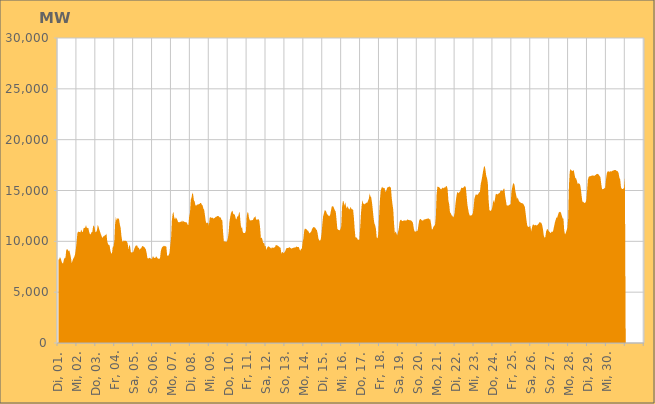
| Category | Series 0 |
|---|---|
|  Di, 01.  | 8195.748 |
|  Di, 01.  | 8238.849 |
|  Di, 01.  | 8448.213 |
|  Di, 01.  | 8317.278 |
|  Di, 01.  | 8026.775 |
|  Di, 01.  | 7834.665 |
|  Di, 01.  | 7841.233 |
|  Di, 01.  | 8211.818 |
|  Di, 01.  | 8380.311 |
|  Di, 01.  | 8387.251 |
|  Di, 01.  | 9177.025 |
|  Di, 01.  | 9213.49 |
|  Di, 01.  | 9177.197 |
|  Di, 01.  | 9025.483 |
|  Di, 01.  | 9093.851 |
|  Di, 01.  | 8730.426 |
|  Di, 01.  | 8338.928 |
|  Mi, 02.  | 7829.012 |
|  Mi, 02.  | 8128.96 |
|  Mi, 02.  | 8304.714 |
|  Mi, 02.  | 8447.873 |
|  Mi, 02.  | 8667.192 |
|  Mi, 02.  | 9152.786 |
|  Mi, 02.  | 9833.066 |
|  Mi, 02.  | 10735.695 |
|  Mi, 02.  | 10973.93 |
|  Mi, 02.  | 10916.105 |
|  Mi, 02.  | 10926.679 |
|  Mi, 02.  | 10882.582 |
|  Mi, 02.  | 11165.676 |
|  Mi, 02.  | 10942.484 |
|  Mi, 02.  | 10916.844 |
|  Mi, 02.  | 11291.559 |
|  Mi, 02.  | 11317.902 |
|  Mi, 02.  | 11347.952 |
|  Mi, 02.  | 11594.607 |
|  Mi, 02.  | 11353.739 |
|  Mi, 02.  | 11295.324 |
|  Mi, 02.  | 11309.941 |
|  Mi, 02.  | 10937.813 |
|  Mi, 02.  | 10712.686 |
|  Do, 03.  | 10686.607 |
|  Do, 03.  | 10903.154 |
|  Do, 03.  | 10908.265 |
|  Do, 03.  | 11449.21 |
|  Do, 03.  | 11578.012 |
|  Do, 03.  | 11331.532 |
|  Do, 03.  | 10887.95 |
|  Do, 03.  | 10930.703 |
|  Do, 03.  | 11110.092 |
|  Do, 03.  | 11633.787 |
|  Do, 03.  | 11418.343 |
|  Do, 03.  | 11127.158 |
|  Do, 03.  | 10905.367 |
|  Do, 03.  | 10682.636 |
|  Do, 03.  | 10485.257 |
|  Do, 03.  | 10315.151 |
|  Do, 03.  | 10492.304 |
|  Do, 03.  | 10504.689 |
|  Do, 03.  | 10591.212 |
|  Do, 03.  | 10631.174 |
|  Do, 03.  | 10757.819 |
|  Do, 03.  | 9997.156 |
|  Do, 03.  | 9725.87 |
|  Do, 03.  | 9635.19 |
|  Fr, 04.  | 9598.394 |
|  Fr, 04.  | 9080.654 |
|  Fr, 04.  | 8808.541 |
|  Fr, 04.  | 8827.586 |
|  Fr, 04.  | 9450.754 |
|  Fr, 04.  | 9495.729 |
|  Fr, 04.  | 10032.6 |
|  Fr, 04.  | 11703.268 |
|  Fr, 04.  | 12401.475 |
|  Fr, 04.  | 12034.678 |
|  Fr, 04.  | 12263.784 |
|  Fr, 04.  | 12267.227 |
|  Fr, 04.  | 12158.76 |
|  Fr, 04.  | 11661.449 |
|  Fr, 04.  | 11325.073 |
|  Fr, 04.  | 10535.536 |
|  Fr, 04.  | 10026.175 |
|  Fr, 04.  | 9957.082 |
|  Fr, 04.  | 10100.934 |
|  Fr, 04.  | 10036.933 |
|  Fr, 04.  | 10050.077 |
|  Fr, 04.  | 10037.434 |
|  Fr, 04.  | 9974.075 |
|  Fr, 04.  | 9746.908 |
|  Sa, 05.  | 9178.41 |
|  Sa, 05.  | 9691.841 |
|  Sa, 05.  | 9490.762 |
|  Sa, 05.  | 8945.014 |
|  Sa, 05.  | 8897.307 |
|  Sa, 05.  | 8922.861 |
|  Sa, 05.  | 8954.198 |
|  Sa, 05.  | 9203.137 |
|  Sa, 05.  | 9402.483 |
|  Sa, 05.  | 9558.636 |
|  Sa, 05.  | 9597.176 |
|  Sa, 05.  | 9587.965 |
|  Sa, 05.  | 9354.447 |
|  Sa, 05.  | 9389.859 |
|  Sa, 05.  | 9162.686 |
|  Sa, 05.  | 9291.054 |
|  Sa, 05.  | 9308.196 |
|  Sa, 05.  | 9484.902 |
|  Sa, 05.  | 9557.742 |
|  Sa, 05.  | 9482.572 |
|  Sa, 05.  | 9433.346 |
|  Sa, 05.  | 9336.187 |
|  Sa, 05.  | 9199.284 |
|  Sa, 05.  | 8848.052 |
|  So, 06.  | 8344.83 |
|  So, 06.  | 8314.266 |
|  So, 06.  | 8345.908 |
|  So, 06.  | 8396.474 |
|  So, 06.  | 8318.311 |
|  So, 06.  | 8248.532 |
|  So, 06.  | 8317.737 |
|  So, 06.  | 8555.444 |
|  So, 06.  | 8428.29 |
|  So, 06.  | 8365.316 |
|  So, 06.  | 8372.023 |
|  So, 06.  | 8532.385 |
|  So, 06.  | 8435.157 |
|  So, 06.  | 8331.923 |
|  So, 06.  | 8282.984 |
|  So, 06.  | 8276.148 |
|  So, 06.  | 8359.805 |
|  So, 06.  | 9040.527 |
|  So, 06.  | 9328.213 |
|  So, 06.  | 9456 |
|  So, 06.  | 9506.892 |
|  So, 06.  | 9581.173 |
|  So, 06.  | 9507.567 |
|  So, 06.  | 9530.964 |
|  Mo, 07.  | 9476.245 |
|  Mo, 07.  | 8650.818 |
|  Mo, 07.  | 8542.105 |
|  Mo, 07.  | 8649.919 |
|  Mo, 07.  | 8855.606 |
|  Mo, 07.  | 9636.52 |
|  Mo, 07.  | 10288.136 |
|  Mo, 07.  | 12020.957 |
|  Mo, 07.  | 12712.978 |
|  Mo, 07.  | 12901.594 |
|  Mo, 07.  | 12364.981 |
|  Mo, 07.  | 12151.775 |
|  Mo, 07.  | 12352.799 |
|  Mo, 07.  | 12254.523 |
|  Mo, 07.  | 12107.756 |
|  Mo, 07.  | 11871.108 |
|  Mo, 07.  | 11903.832 |
|  Mo, 07.  | 11871.006 |
|  Mo, 07.  | 11932.709 |
|  Mo, 07.  | 11910.709 |
|  Mo, 07.  | 12060.214 |
|  Mo, 07.  | 11881.257 |
|  Mo, 07.  | 12016.33 |
|  Mo, 07.  | 11898.64 |
|  Di, 08.  | 11883.132 |
|  Di, 08.  | 11891.17 |
|  Di, 08.  | 11851.836 |
|  Di, 08.  | 11636.756 |
|  Di, 08.  | 11610.184 |
|  Di, 08.  | 12455.817 |
|  Di, 08.  | 12805.531 |
|  Di, 08.  | 14065.491 |
|  Di, 08.  | 14323.256 |
|  Di, 08.  | 14791.72 |
|  Di, 08.  | 14610.173 |
|  Di, 08.  | 14030.744 |
|  Di, 08.  | 13913.304 |
|  Di, 08.  | 13527.604 |
|  Di, 08.  | 13522.695 |
|  Di, 08.  | 13608.676 |
|  Di, 08.  | 13617.428 |
|  Di, 08.  | 13650.402 |
|  Di, 08.  | 13669.478 |
|  Di, 08.  | 13770.425 |
|  Di, 08.  | 13771.482 |
|  Di, 08.  | 13608.11 |
|  Di, 08.  | 13541.896 |
|  Di, 08.  | 13222.64 |
|  Mi, 09.  | 13104.114 |
|  Mi, 09.  | 12565.42 |
|  Mi, 09.  | 11981.096 |
|  Mi, 09.  | 11765.054 |
|  Mi, 09.  | 11837.351 |
|  Mi, 09.  | 11810.66 |
|  Mi, 09.  | 11563.377 |
|  Mi, 09.  | 12322.461 |
|  Mi, 09.  | 12384.471 |
|  Mi, 09.  | 12313.741 |
|  Mi, 09.  | 12311.941 |
|  Mi, 09.  | 12323.85 |
|  Mi, 09.  | 12226.455 |
|  Mi, 09.  | 12291.333 |
|  Mi, 09.  | 12339.328 |
|  Mi, 09.  | 12420.534 |
|  Mi, 09.  | 12438.141 |
|  Mi, 09.  | 12504.573 |
|  Mi, 09.  | 12492.546 |
|  Mi, 09.  | 12412.849 |
|  Mi, 09.  | 12338.849 |
|  Mi, 09.  | 12359.02 |
|  Mi, 09.  | 12113.066 |
|  Mi, 09.  | 12091.532 |
|  Do, 10.  | 10925.678 |
|  Do, 10.  | 10020.023 |
|  Do, 10.  | 9986.644 |
|  Do, 10.  | 9976.224 |
|  Do, 10.  | 9940.36 |
|  Do, 10.  | 10017.58 |
|  Do, 10.  | 10280.962 |
|  Do, 10.  | 10827.935 |
|  Do, 10.  | 11855.459 |
|  Do, 10.  | 12372.422 |
|  Do, 10.  | 12772.304 |
|  Do, 10.  | 12936.441 |
|  Do, 10.  | 13012.453 |
|  Do, 10.  | 12702.477 |
|  Do, 10.  | 12659.864 |
|  Do, 10.  | 12607.085 |
|  Do, 10.  | 12252.856 |
|  Do, 10.  | 12141.641 |
|  Do, 10.  | 12461.787 |
|  Do, 10.  | 12429.468 |
|  Do, 10.  | 12713.405 |
|  Do, 10.  | 12908.483 |
|  Do, 10.  | 11999.901 |
|  Do, 10.  | 11261.483 |
|  Fr, 11.  | 11475.599 |
|  Fr, 11.  | 10923.63 |
|  Fr, 11.  | 10827.726 |
|  Fr, 11.  | 10810.376 |
|  Fr, 11.  | 10832.162 |
|  Fr, 11.  | 11015.182 |
|  Fr, 11.  | 12455.202 |
|  Fr, 11.  | 12860.272 |
|  Fr, 11.  | 12793.256 |
|  Fr, 11.  | 12273.488 |
|  Fr, 11.  | 12073.613 |
|  Fr, 11.  | 12056.748 |
|  Fr, 11.  | 12067.402 |
|  Fr, 11.  | 12081.542 |
|  Fr, 11.  | 12110.027 |
|  Fr, 11.  | 12319.636 |
|  Fr, 11.  | 12353.928 |
|  Fr, 11.  | 12471.629 |
|  Fr, 11.  | 12120.726 |
|  Fr, 11.  | 12150.662 |
|  Fr, 11.  | 12142.492 |
|  Fr, 11.  | 12181.85 |
|  Fr, 11.  | 12042.792 |
|  Fr, 11.  | 11352.511 |
|  Sa, 12.  | 10322.609 |
|  Sa, 12.  | 10375.244 |
|  Sa, 12.  | 10155.103 |
|  Sa, 12.  | 9783.303 |
|  Sa, 12.  | 9906.55 |
|  Sa, 12.  | 9518.944 |
|  Sa, 12.  | 9556.322 |
|  Sa, 12.  | 9163.012 |
|  Sa, 12.  | 9375.98 |
|  Sa, 12.  | 9474.36 |
|  Sa, 12.  | 9514.349 |
|  Sa, 12.  | 9435.292 |
|  Sa, 12.  | 9368.071 |
|  Sa, 12.  | 9288.444 |
|  Sa, 12.  | 9407.215 |
|  Sa, 12.  | 9367.282 |
|  Sa, 12.  | 9364.493 |
|  Sa, 12.  | 9391.802 |
|  Sa, 12.  | 9447.633 |
|  Sa, 12.  | 9641.122 |
|  Sa, 12.  | 9605.457 |
|  Sa, 12.  | 9595.95 |
|  Sa, 12.  | 9530.542 |
|  Sa, 12.  | 9479.684 |
|  So, 13.  | 9402.282 |
|  So, 13.  | 9353.528 |
|  So, 13.  | 8787.718 |
|  So, 13.  | 8959.875 |
|  So, 13.  | 8888.206 |
|  So, 13.  | 8819.799 |
|  So, 13.  | 8940.93 |
|  So, 13.  | 9061.199 |
|  So, 13.  | 9282.269 |
|  So, 13.  | 9343.571 |
|  So, 13.  | 9335.718 |
|  So, 13.  | 9344.587 |
|  So, 13.  | 9427.672 |
|  So, 13.  | 9381.388 |
|  So, 13.  | 9318.767 |
|  So, 13.  | 9287.055 |
|  So, 13.  | 9324.947 |
|  So, 13.  | 9371.255 |
|  So, 13.  | 9379.228 |
|  So, 13.  | 9403.108 |
|  So, 13.  | 9396.537 |
|  So, 13.  | 9496.683 |
|  So, 13.  | 9450.124 |
|  So, 13.  | 9454.469 |
|  Mo, 14.  | 9454.113 |
|  Mo, 14.  | 9231.345 |
|  Mo, 14.  | 9079.792 |
|  Mo, 14.  | 9260.012 |
|  Mo, 14.  | 9281.442 |
|  Mo, 14.  | 9950.238 |
|  Mo, 14.  | 10286.881 |
|  Mo, 14.  | 11072.164 |
|  Mo, 14.  | 11277.426 |
|  Mo, 14.  | 11209.981 |
|  Mo, 14.  | 11182.23 |
|  Mo, 14.  | 11077.363 |
|  Mo, 14.  | 11038.028 |
|  Mo, 14.  | 10877.053 |
|  Mo, 14.  | 10782.045 |
|  Mo, 14.  | 10886.924 |
|  Mo, 14.  | 10977.081 |
|  Mo, 14.  | 11224.929 |
|  Mo, 14.  | 11329.572 |
|  Mo, 14.  | 11423.828 |
|  Mo, 14.  | 11373.026 |
|  Mo, 14.  | 11342.005 |
|  Mo, 14.  | 11169.935 |
|  Mo, 14.  | 11125.267 |
|  Di, 15.  | 10803.849 |
|  Di, 15.  | 10285.265 |
|  Di, 15.  | 10105.239 |
|  Di, 15.  | 10057.104 |
|  Di, 15.  | 10197.444 |
|  Di, 15.  | 10767.414 |
|  Di, 15.  | 11698.56 |
|  Di, 15.  | 12468.519 |
|  Di, 15.  | 12742.367 |
|  Di, 15.  | 13062.44 |
|  Di, 15.  | 13039.458 |
|  Di, 15.  | 12904.463 |
|  Di, 15.  | 12648.656 |
|  Di, 15.  | 12643.43 |
|  Di, 15.  | 12492.315 |
|  Di, 15.  | 12472.605 |
|  Di, 15.  | 12625.477 |
|  Di, 15.  | 13063.476 |
|  Di, 15.  | 13421.844 |
|  Di, 15.  | 13451.524 |
|  Di, 15.  | 13426.649 |
|  Di, 15.  | 13223.838 |
|  Di, 15.  | 13042.894 |
|  Di, 15.  | 12921.23 |
|  Mi, 16.  | 12142.47 |
|  Mi, 16.  | 11254.172 |
|  Mi, 16.  | 11139.8 |
|  Mi, 16.  | 11111.35 |
|  Mi, 16.  | 11079.981 |
|  Mi, 16.  | 11209.683 |
|  Mi, 16.  | 11508.685 |
|  Mi, 16.  | 13366.166 |
|  Mi, 16.  | 13936.51 |
|  Mi, 16.  | 13940.843 |
|  Mi, 16.  | 13496.852 |
|  Mi, 16.  | 13842.456 |
|  Mi, 16.  | 13482.637 |
|  Mi, 16.  | 13233.382 |
|  Mi, 16.  | 13460.442 |
|  Mi, 16.  | 13286.975 |
|  Mi, 16.  | 13126.097 |
|  Mi, 16.  | 13223.967 |
|  Mi, 16.  | 13385.532 |
|  Mi, 16.  | 13183.27 |
|  Mi, 16.  | 13140.092 |
|  Mi, 16.  | 13138.912 |
|  Mi, 16.  | 12360.539 |
|  Mi, 16.  | 11241.783 |
|  Do, 17.  | 10385.731 |
|  Do, 17.  | 10398.681 |
|  Do, 17.  | 10314.264 |
|  Do, 17.  | 10167.454 |
|  Do, 17.  | 10164.147 |
|  Do, 17.  | 10190.068 |
|  Do, 17.  | 11335.343 |
|  Do, 17.  | 12736.84 |
|  Do, 17.  | 13591.592 |
|  Do, 17.  | 14051.581 |
|  Do, 17.  | 13670.167 |
|  Do, 17.  | 13710.763 |
|  Do, 17.  | 13623.35 |
|  Do, 17.  | 13753.391 |
|  Do, 17.  | 13810.386 |
|  Do, 17.  | 13787.127 |
|  Do, 17.  | 13997.426 |
|  Do, 17.  | 14190.174 |
|  Do, 17.  | 14697.928 |
|  Do, 17.  | 14429.228 |
|  Do, 17.  | 14317.667 |
|  Do, 17.  | 13826.244 |
|  Do, 17.  | 13108.187 |
|  Do, 17.  | 12332.106 |
|  Fr, 18.  | 11772.945 |
|  Fr, 18.  | 11588.687 |
|  Fr, 18.  | 11232.148 |
|  Fr, 18.  | 10364.341 |
|  Fr, 18.  | 10277.513 |
|  Fr, 18.  | 10706.44 |
|  Fr, 18.  | 12498.231 |
|  Fr, 18.  | 13999.429 |
|  Fr, 18.  | 14934.914 |
|  Fr, 18.  | 15230.593 |
|  Fr, 18.  | 15375.245 |
|  Fr, 18.  | 15219.684 |
|  Fr, 18.  | 15279.526 |
|  Fr, 18.  | 15225.412 |
|  Fr, 18.  | 14882.732 |
|  Fr, 18.  | 14948.616 |
|  Fr, 18.  | 15200.742 |
|  Fr, 18.  | 15351.29 |
|  Fr, 18.  | 15325.204 |
|  Fr, 18.  | 15422.389 |
|  Fr, 18.  | 15314.916 |
|  Fr, 18.  | 15302.016 |
|  Fr, 18.  | 14316.111 |
|  Fr, 18.  | 13640.496 |
|  Sa, 19.  | 13118.295 |
|  Sa, 19.  | 11735.583 |
|  Sa, 19.  | 10796.746 |
|  Sa, 19.  | 10979.87 |
|  Sa, 19.  | 10796.767 |
|  Sa, 19.  | 10572.507 |
|  Sa, 19.  | 10898.889 |
|  Sa, 19.  | 11237.203 |
|  Sa, 19.  | 11901.354 |
|  Sa, 19.  | 12093.529 |
|  Sa, 19.  | 12124.037 |
|  Sa, 19.  | 12013.999 |
|  Sa, 19.  | 11997.416 |
|  Sa, 19.  | 12043.304 |
|  Sa, 19.  | 12066.049 |
|  Sa, 19.  | 12038.29 |
|  Sa, 19.  | 12052.748 |
|  Sa, 19.  | 12058.161 |
|  Sa, 19.  | 12171.084 |
|  Sa, 19.  | 12095.582 |
|  Sa, 19.  | 12118.139 |
|  Sa, 19.  | 12051.855 |
|  Sa, 19.  | 12079.003 |
|  Sa, 19.  | 12019.283 |
|  So, 20.  | 11946 |
|  So, 20.  | 11808.219 |
|  So, 20.  | 11302.946 |
|  So, 20.  | 10991.224 |
|  So, 20.  | 10949.353 |
|  So, 20.  | 10973.641 |
|  So, 20.  | 11032.367 |
|  So, 20.  | 11065.113 |
|  So, 20.  | 11631.723 |
|  So, 20.  | 12077.68 |
|  So, 20.  | 12197.103 |
|  So, 20.  | 12185.583 |
|  So, 20.  | 12074.759 |
|  So, 20.  | 12039.211 |
|  So, 20.  | 12048.113 |
|  So, 20.  | 12170.63 |
|  So, 20.  | 12130.874 |
|  So, 20.  | 12187.984 |
|  So, 20.  | 12198.49 |
|  So, 20.  | 12246.369 |
|  So, 20.  | 12224.906 |
|  So, 20.  | 12258.332 |
|  So, 20.  | 12153.565 |
|  So, 20.  | 12171.156 |
|  Mo, 21.  | 11719.575 |
|  Mo, 21.  | 11195.108 |
|  Mo, 21.  | 11176.291 |
|  Mo, 21.  | 11441.603 |
|  Mo, 21.  | 11519.665 |
|  Mo, 21.  | 11620.741 |
|  Mo, 21.  | 12302.281 |
|  Mo, 21.  | 14580.875 |
|  Mo, 21.  | 15370.098 |
|  Mo, 21.  | 15358.373 |
|  Mo, 21.  | 15340.948 |
|  Mo, 21.  | 15258.866 |
|  Mo, 21.  | 15139.052 |
|  Mo, 21.  | 15126.078 |
|  Mo, 21.  | 15212.094 |
|  Mo, 21.  | 15293.925 |
|  Mo, 21.  | 15205.461 |
|  Mo, 21.  | 15308.865 |
|  Mo, 21.  | 15305.221 |
|  Mo, 21.  | 15419.92 |
|  Mo, 21.  | 15440.573 |
|  Mo, 21.  | 15109.923 |
|  Mo, 21.  | 13999.247 |
|  Mo, 21.  | 13644.549 |
|  Di, 22.  | 12840.87 |
|  Di, 22.  | 12766.137 |
|  Di, 22.  | 12565.064 |
|  Di, 22.  | 12524.73 |
|  Di, 22.  | 12370.44 |
|  Di, 22.  | 12480.132 |
|  Di, 22.  | 12838.006 |
|  Di, 22.  | 13736.431 |
|  Di, 22.  | 14343.632 |
|  Di, 22.  | 14797.236 |
|  Di, 22.  | 14836.032 |
|  Di, 22.  | 14723.147 |
|  Di, 22.  | 14860.838 |
|  Di, 22.  | 14930.747 |
|  Di, 22.  | 15198.742 |
|  Di, 22.  | 15291.16 |
|  Di, 22.  | 15241.331 |
|  Di, 22.  | 15281.096 |
|  Di, 22.  | 15393.497 |
|  Di, 22.  | 15428.451 |
|  Di, 22.  | 15338.537 |
|  Di, 22.  | 14575.956 |
|  Di, 22.  | 13674.732 |
|  Di, 22.  | 13184.33 |
|  Mi, 23.  | 12774.361 |
|  Mi, 23.  | 12539.334 |
|  Mi, 23.  | 12543.978 |
|  Mi, 23.  | 12553.861 |
|  Mi, 23.  | 12605.1 |
|  Mi, 23.  | 12750.732 |
|  Mi, 23.  | 13377.493 |
|  Mi, 23.  | 14202.872 |
|  Mi, 23.  | 14457.356 |
|  Mi, 23.  | 14646.57 |
|  Mi, 23.  | 14553.361 |
|  Mi, 23.  | 14579.983 |
|  Mi, 23.  | 14687.044 |
|  Mi, 23.  | 14817.827 |
|  Mi, 23.  | 14872.031 |
|  Mi, 23.  | 15633.288 |
|  Mi, 23.  | 15975.09 |
|  Mi, 23.  | 16431.908 |
|  Mi, 23.  | 16888.847 |
|  Mi, 23.  | 17279.929 |
|  Mi, 23.  | 17423.3 |
|  Mi, 23.  | 17037.7 |
|  Mi, 23.  | 16454.485 |
|  Mi, 23.  | 16207.803 |
|  Do, 24.  | 15751.041 |
|  Do, 24.  | 14069.381 |
|  Do, 24.  | 13086.498 |
|  Do, 24.  | 13007.998 |
|  Do, 24.  | 13003.173 |
|  Do, 24.  | 13152.355 |
|  Do, 24.  | 13480.793 |
|  Do, 24.  | 14074.107 |
|  Do, 24.  | 13778.721 |
|  Do, 24.  | 14089.587 |
|  Do, 24.  | 14613.659 |
|  Do, 24.  | 14682.603 |
|  Do, 24.  | 14602.608 |
|  Do, 24.  | 14657.608 |
|  Do, 24.  | 14715.637 |
|  Do, 24.  | 14760.452 |
|  Do, 24.  | 14949.143 |
|  Do, 24.  | 14986.007 |
|  Do, 24.  | 14995.571 |
|  Do, 24.  | 14937.772 |
|  Do, 24.  | 15174.021 |
|  Do, 24.  | 15179.499 |
|  Do, 24.  | 14488.662 |
|  Do, 24.  | 13998.387 |
|  Fr, 25.  | 13522.404 |
|  Fr, 25.  | 13537.716 |
|  Fr, 25.  | 13499.233 |
|  Fr, 25.  | 13604.513 |
|  Fr, 25.  | 13607.644 |
|  Fr, 25.  | 13678.314 |
|  Fr, 25.  | 14855.479 |
|  Fr, 25.  | 15319.322 |
|  Fr, 25.  | 15655.064 |
|  Fr, 25.  | 15730.227 |
|  Fr, 25.  | 15489.307 |
|  Fr, 25.  | 14918.067 |
|  Fr, 25.  | 14566.069 |
|  Fr, 25.  | 14159.796 |
|  Fr, 25.  | 14319.783 |
|  Fr, 25.  | 14071.804 |
|  Fr, 25.  | 13890.701 |
|  Fr, 25.  | 13872.989 |
|  Fr, 25.  | 13762.91 |
|  Fr, 25.  | 13760.723 |
|  Fr, 25.  | 13738.268 |
|  Fr, 25.  | 13690.757 |
|  Fr, 25.  | 13527.257 |
|  Fr, 25.  | 13388.197 |
|  Sa, 26.  | 12768.4 |
|  Sa, 26.  | 12116.083 |
|  Sa, 26.  | 11564.949 |
|  Sa, 26.  | 11435.611 |
|  Sa, 26.  | 11413.49 |
|  Sa, 26.  | 11465.686 |
|  Sa, 26.  | 11493.559 |
|  Sa, 26.  | 10983.106 |
|  Sa, 26.  | 11343.5 |
|  Sa, 26.  | 11631.607 |
|  Sa, 26.  | 11671.813 |
|  Sa, 26.  | 11552.042 |
|  Sa, 26.  | 11631.682 |
|  Sa, 26.  | 11580.232 |
|  Sa, 26.  | 11562.559 |
|  Sa, 26.  | 11604.1 |
|  Sa, 26.  | 11680.885 |
|  Sa, 26.  | 11810.169 |
|  Sa, 26.  | 11896.488 |
|  Sa, 26.  | 11844.316 |
|  Sa, 26.  | 11802.335 |
|  Sa, 26.  | 11588.464 |
|  Sa, 26.  | 11181.996 |
|  Sa, 26.  | 10584.767 |
|  So, 27.  | 10361.347 |
|  So, 27.  | 10412.777 |
|  So, 27.  | 10951.92 |
|  So, 27.  | 11174.663 |
|  So, 27.  | 11217.713 |
|  So, 27.  | 11025.623 |
|  So, 27.  | 10948.368 |
|  So, 27.  | 10869.811 |
|  So, 27.  | 10809.314 |
|  So, 27.  | 10969.494 |
|  So, 27.  | 10907.421 |
|  So, 27.  | 11053.097 |
|  So, 27.  | 11427.815 |
|  So, 27.  | 11811.904 |
|  So, 27.  | 12085.796 |
|  So, 27.  | 12333.71 |
|  So, 27.  | 12330.051 |
|  So, 27.  | 12577.657 |
|  So, 27.  | 12836.056 |
|  So, 27.  | 12893.867 |
|  So, 27.  | 12904.781 |
|  So, 27.  | 12771.125 |
|  So, 27.  | 12504.935 |
|  So, 27.  | 12265.689 |
|  Mo, 28.  | 12227.166 |
|  Mo, 28.  | 11051.793 |
|  Mo, 28.  | 10674.293 |
|  Mo, 28.  | 10827.131 |
|  Mo, 28.  | 11084.192 |
|  Mo, 28.  | 11333.458 |
|  Mo, 28.  | 12250.887 |
|  Mo, 28.  | 15525.756 |
|  Mo, 28.  | 16865.381 |
|  Mo, 28.  | 17108.374 |
|  Mo, 28.  | 16993.478 |
|  Mo, 28.  | 16909.74 |
|  Mo, 28.  | 16952.64 |
|  Mo, 28.  | 17015.576 |
|  Mo, 28.  | 16623.437 |
|  Mo, 28.  | 16225.598 |
|  Mo, 28.  | 16198.139 |
|  Mo, 28.  | 15962.201 |
|  Mo, 28.  | 15649.333 |
|  Mo, 28.  | 15714.667 |
|  Mo, 28.  | 15686.911 |
|  Mo, 28.  | 15595.75 |
|  Mo, 28.  | 15205.994 |
|  Mo, 28.  | 14511.033 |
|  Di, 29.  | 13917.256 |
|  Di, 29.  | 13897.168 |
|  Di, 29.  | 13817.849 |
|  Di, 29.  | 13758.787 |
|  Di, 29.  | 13825.859 |
|  Di, 29.  | 14033.041 |
|  Di, 29.  | 14994.006 |
|  Di, 29.  | 16047.721 |
|  Di, 29.  | 16329.403 |
|  Di, 29.  | 16390.528 |
|  Di, 29.  | 16395.549 |
|  Di, 29.  | 16445.05 |
|  Di, 29.  | 16460.857 |
|  Di, 29.  | 16472.36 |
|  Di, 29.  | 16469.798 |
|  Di, 29.  | 16434.43 |
|  Di, 29.  | 16491.488 |
|  Di, 29.  | 16537.421 |
|  Di, 29.  | 16617.777 |
|  Di, 29.  | 16638.07 |
|  Di, 29.  | 16622.057 |
|  Di, 29.  | 16518.373 |
|  Di, 29.  | 16416.378 |
|  Di, 29.  | 16281.025 |
|  Mi, 30.  | 15602.778 |
|  Mi, 30.  | 15130.069 |
|  Mi, 30.  | 15138.451 |
|  Mi, 30.  | 15161.738 |
|  Mi, 30.  | 15220.328 |
|  Mi, 30.  | 15286.873 |
|  Mi, 30.  | 16074.702 |
|  Mi, 30.  | 16682.94 |
|  Mi, 30.  | 16861.457 |
|  Mi, 30.  | 16912.875 |
|  Mi, 30.  | 16801.877 |
|  Mi, 30.  | 16898.484 |
|  Mi, 30.  | 16881.135 |
|  Mi, 30.  | 16874.45 |
|  Mi, 30.  | 16932.805 |
|  Mi, 30.  | 16961.619 |
|  Mi, 30.  | 16987.01 |
|  Mi, 30.  | 17019.616 |
|  Mi, 30.  | 17026.41 |
|  Mi, 30.  | 16946.233 |
|  Mi, 30.  | 16921.058 |
|  Mi, 30.  | 16882.032 |
|  Mi, 30.  | 16701.561 |
|  Mi, 30.  | 16262.556 |
|  Do, 01.  | 16103.199 |
|  Do, 01.  | 15324.421 |
|  Do, 01.  | 15167.287 |
|  Do, 01.  | 15141.087 |
|  Do, 01.  | 15170.172 |
|  Do, 01.  | 15288.052 |
|    | 16194.298 |
|    | 0 |
|    | 0 |
|    | 0 |
|    | 0 |
|    | 0 |
|    | 0 |
|    | 0 |
|    | 0 |
|    | 0 |
|    | 0 |
|    | 0 |
|    | 0 |
|    | 0 |
|    | 0 |
|    | 0 |
|    | 0 |
|    | 0 |
|    | 0 |
|    | 0 |
|    | 0 |
|    | 0 |
|    | 0 |
|    | 0 |